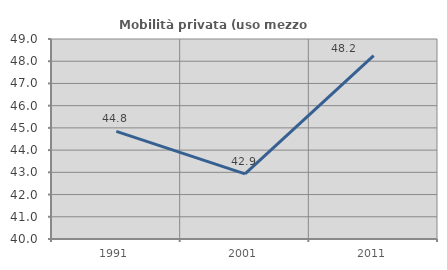
| Category | Mobilità privata (uso mezzo privato) |
|---|---|
| 1991.0 | 44.845 |
| 2001.0 | 42.932 |
| 2011.0 | 48.25 |